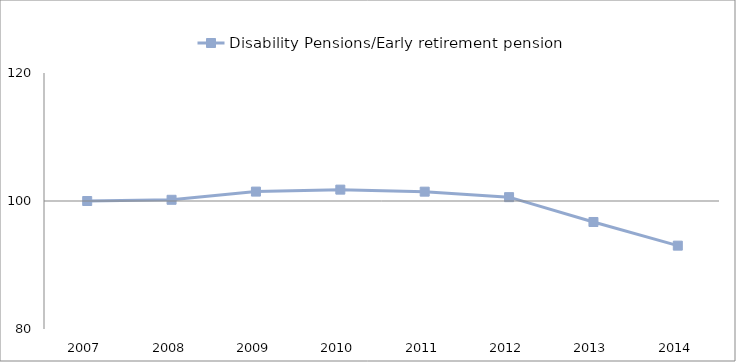
| Category | Disability Pensions/Early retirement pension | 0 |
|---|---|---|
| 2007.0 | 100 |  |
| 2008.0 | 100.188 |  |
| 2009.0 | 101.469 |  |
| 2010.0 | 101.776 |  |
| 2011.0 | 101.46 |  |
| 2012.0 | 100.602 |  |
| 2013.0 | 96.72 |  |
| 2014.0 | 93.024 |  |